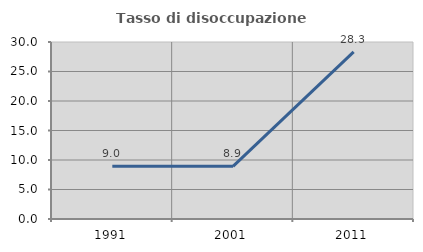
| Category | Tasso di disoccupazione giovanile  |
|---|---|
| 1991.0 | 8.951 |
| 2001.0 | 8.92 |
| 2011.0 | 28.333 |